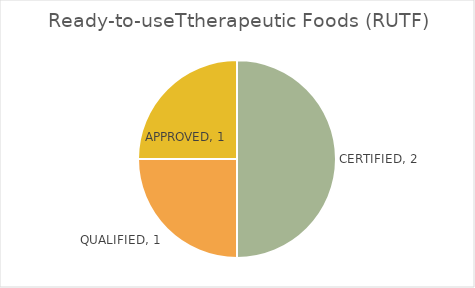
| Category | Ready-to-useTtherapeutic Foods (RUTF) |
|---|---|
| CERTIFIED | 2 |
| QUALIFIED | 1 |
| APPROVED | 1 |